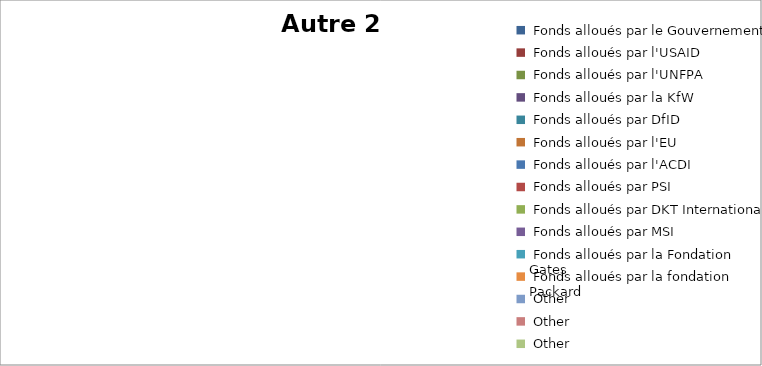
| Category |  Autre 2  |
|---|---|
|  Fonds alloués par le Gouvernement   | 0 |
|  Fonds alloués par l'USAID   | 0 |
|  Fonds alloués par l'UNFPA  | 0 |
|  Fonds alloués par la KfW  | 0 |
|  Fonds alloués par DfID  | 0 |
|  Fonds alloués par l'EU   | 0 |
|  Fonds alloués par l'ACDI  | 0 |
|  Fonds alloués par PSI  | 0 |
|  Fonds alloués par DKT International   | 0 |
|  Fonds alloués par MSI  | 0 |
|  Fonds alloués par la Fondation Gates  | 0 |
|  Fonds alloués par la fondation Packard  | 0 |
|  Other  | 0 |
|  Other  | 0 |
|  Other  | 0 |
|  Other  | 0 |
|  Other  | 0 |
|  Other  | 0 |
|  Other  | 0 |
|  Other  | 0 |